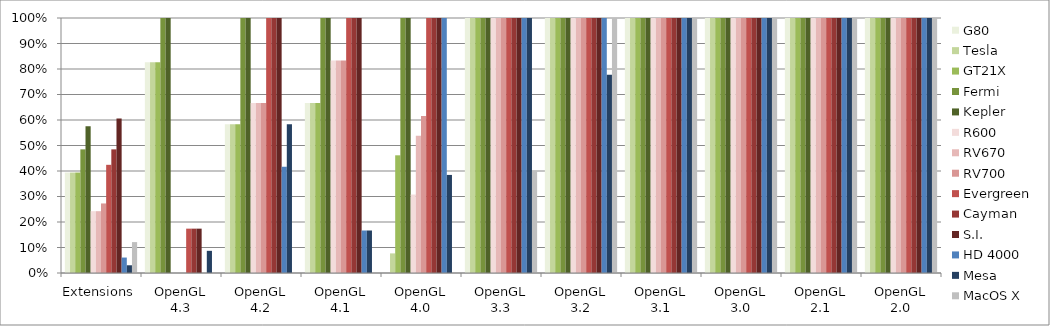
| Category | G80 | Tesla | GT21X | Fermi | Kepler | R600 | RV670 | RV700 | Evergreen | Cayman | S.I. | HD 4000 | Mesa | MacOS X |
|---|---|---|---|---|---|---|---|---|---|---|---|---|---|---|
| Extensions | 0.394 | 0.394 | 0.394 | 0.485 | 0.576 | 0.242 | 0.242 | 0.273 | 0.424 | 0.485 | 0.606 | 0.061 | 0.03 | 0.121 |
| OpenGL 4.3 | 0.826 | 0.826 | 0.826 | 1 | 1 | 0 | 0 | 0 | 0.174 | 0.174 | 0.174 | 0 | 0.087 | 0 |
| OpenGL 4.2 | 0.583 | 0.583 | 0.583 | 1 | 1 | 0.667 | 0.667 | 0.667 | 1 | 1 | 1 | 0.417 | 0.583 | 0 |
| OpenGL 4.1 | 0.667 | 0.667 | 0.667 | 1 | 1 | 0.833 | 0.833 | 0.833 | 1 | 1 | 1 | 0.167 | 0.167 | 0 |
| OpenGL 4.0 | 0 | 0.077 | 0.462 | 1 | 1 | 0.308 | 0.538 | 0.615 | 1 | 1 | 1 | 1 | 0.385 | 0 |
| OpenGL 3.3 | 1 | 1 | 1 | 1 | 1 | 1 | 1 | 1 | 1 | 1 | 1 | 1 | 1 | 0.4 |
| OpenGL 3.2 | 1 | 1 | 1 | 1 | 1 | 1 | 1 | 1 | 1 | 1 | 1 | 1 | 0.778 | 1 |
| OpenGL 3.1 | 1 | 1 | 1 | 1 | 1 | 1 | 1 | 1 | 1 | 1 | 1 | 1 | 1 | 1 |
| OpenGL 3.0 | 1 | 1 | 1 | 1 | 1 | 1 | 1 | 1 | 1 | 1 | 1 | 1 | 1 | 1 |
| OpenGL 2.1 | 1 | 1 | 1 | 1 | 1 | 1 | 1 | 1 | 1 | 1 | 1 | 1 | 1 | 1 |
| OpenGL 2.0 | 1 | 1 | 1 | 1 | 1 | 1 | 1 | 1 | 1 | 1 | 1 | 1 | 1 | 1 |